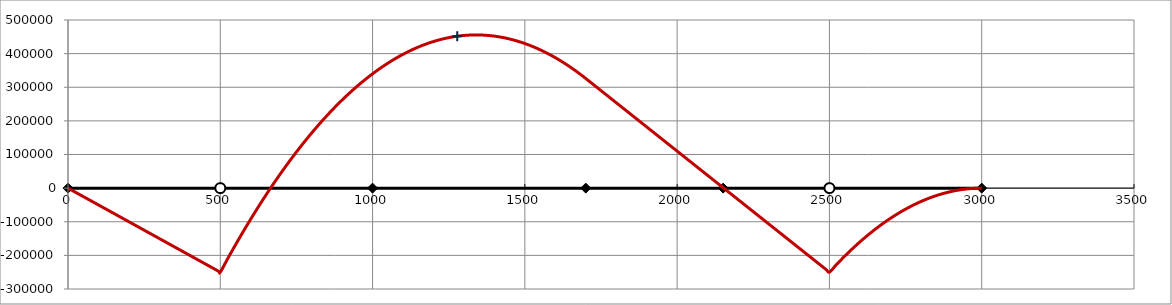
| Category | Nœud |
|---|---|
| 0.0 | 0 |
| 500.0 | 0 |
| 1000.0 | 0 |
| 1700.0 | 0 |
| 2151.0 | 0 |
| 2500.0 | 0 |
| 3000.0 | 0 |
| nan | 0 |
| nan | 0 |
| nan | 0 |
| nan | 0 |
| nan | 0 |
| nan | 0 |
| nan | 0 |
| nan | 0 |
| nan | 0 |
| nan | 0 |
| nan | 0 |
| nan | 0 |
| nan | 0 |
| nan | 0 |
| nan | 0 |
| nan | 0 |